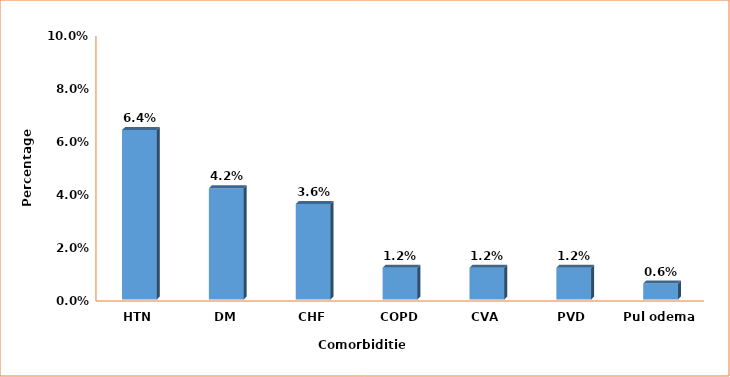
| Category | Series 0 |
|---|---|
| HTN | 0.064 |
| DM | 0.042 |
| CHF | 0.036 |
| COPD | 0.012 |
| CVA | 0.012 |
| PVD | 0.012 |
| Pul odema | 0.006 |